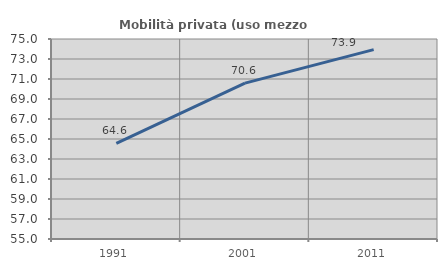
| Category | Mobilità privata (uso mezzo privato) |
|---|---|
| 1991.0 | 64.569 |
| 2001.0 | 70.588 |
| 2011.0 | 73.938 |